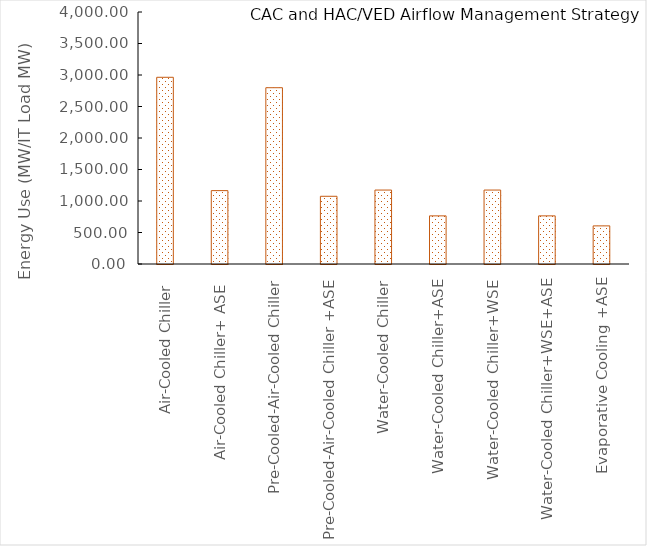
| Category | Series 0 |
|---|---|
| Air-Cooled Chiller  | 2963.592 |
| Air-Cooled Chiller+ ASE  | 1164.813 |
| Pre-Cooled-Air-Cooled Chiller | 2798.216 |
| Pre-Cooled-Air-Cooled Chiller +ASE | 1074.717 |
| Water-Cooled Chiller | 1173.66 |
| Water-Cooled Chiller+ASE | 764.07 |
| Water-Cooled Chiller+WSE | 1173.66 |
| Water-Cooled Chiller+WSE+ASE | 764.071 |
| Evaporative Cooling +ASE | 605.057 |